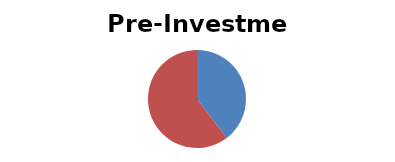
| Category | Series 0 |
|---|---|
| Short-Term | 0.396 |
| Long-Term | 0.604 |